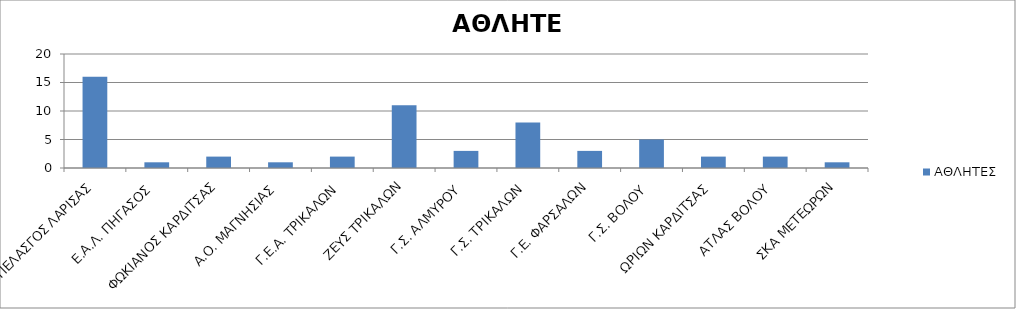
| Category | ΑΘΛΗΤΕΣ |
|---|---|
| ΠΕΛΑΣΓΟΣ ΛΑΡΙΣΑΣ | 16 |
| Ε.Α.Λ. ΠΗΓΑΣΟΣ | 1 |
| ΦΩΚΙΑΝΟΣ ΚΑΡΔΙΤΣΑΣ | 2 |
| Α.Ο. ΜΑΓΝΗΣΙΑΣ | 1 |
| Γ.Ε.Α. ΤΡΙΚΑΛΩΝ | 2 |
| ΖΕΥΣ ΤΡΙΚΑΛΩΝ | 11 |
| Γ.Σ. ΑΛΜΥΡΟΥ | 3 |
| Γ.Σ. ΤΡΙΚΑΛΩΝ | 8 |
| Γ.Ε. ΦΑΡΣΑΛΩΝ | 3 |
| Γ.Σ. ΒΟΛΟΥ | 5 |
| ΩΡΙΩΝ ΚΑΡΔΙΤΣΑΣ | 2 |
| ΑΤΛΑΣ ΒΟΛΟΥ | 2 |
| ΣΚΑ ΜΕΤΕΩΡΩΝ | 1 |